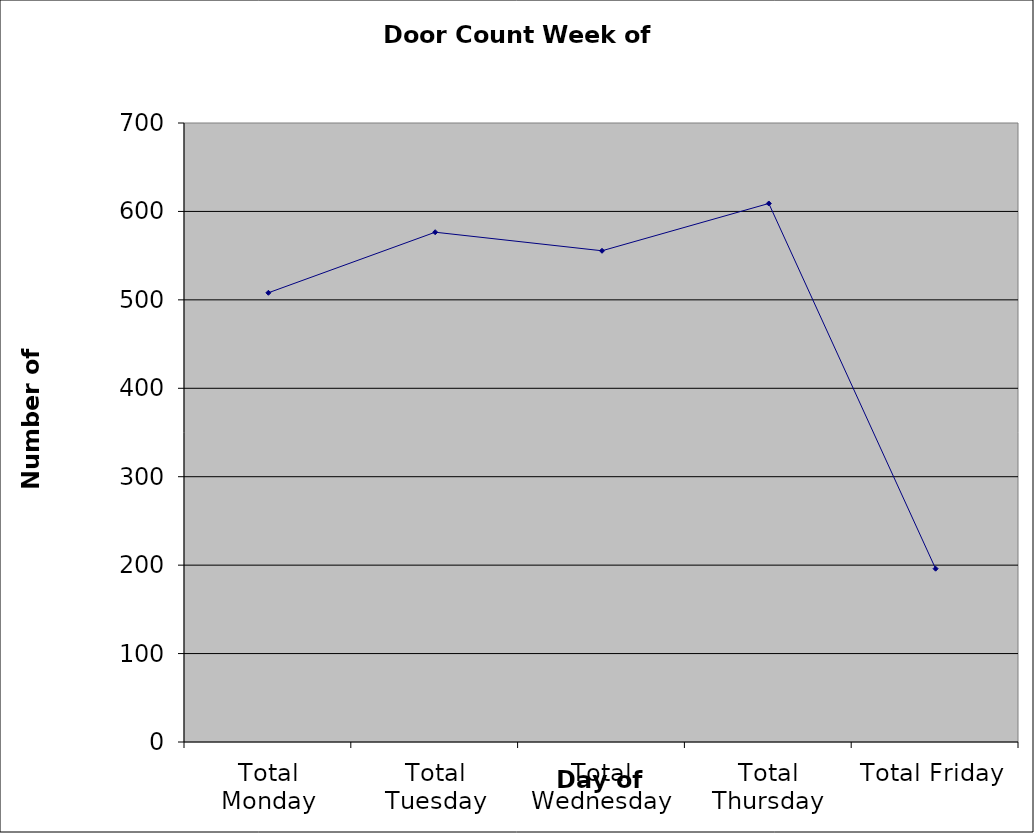
| Category | Series 0 |
|---|---|
| Total Monday | 508 |
| Total Tuesday | 576.5 |
| Total Wednesday | 555.5 |
| Total Thursday | 609 |
| Total Friday | 196 |